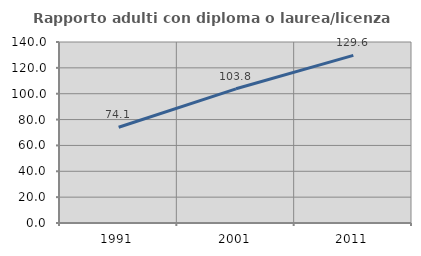
| Category | Rapporto adulti con diploma o laurea/licenza media  |
|---|---|
| 1991.0 | 74.093 |
| 2001.0 | 103.796 |
| 2011.0 | 129.643 |